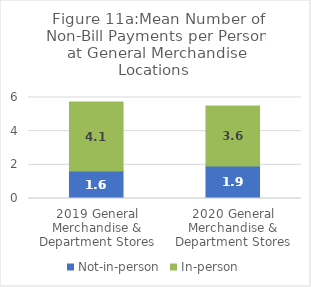
| Category | Not-in-person | In-person |
|---|---|---|
| 2019 General Merchandise & Department Stores | 1.633 | 4.096 |
| 2020 General Merchandise & Department Stores | 1.935 | 3.561 |